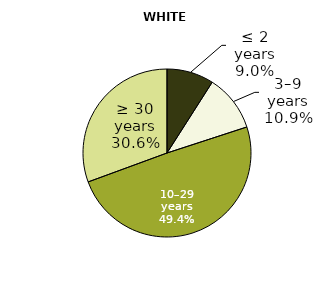
| Category | White varieties |
|---|---|
| up to 2 years | 935.949 |
| 3–9 years | 1132.219 |
| 10–29 years | 5113.042 |
| 30 years and more | 3166.315 |